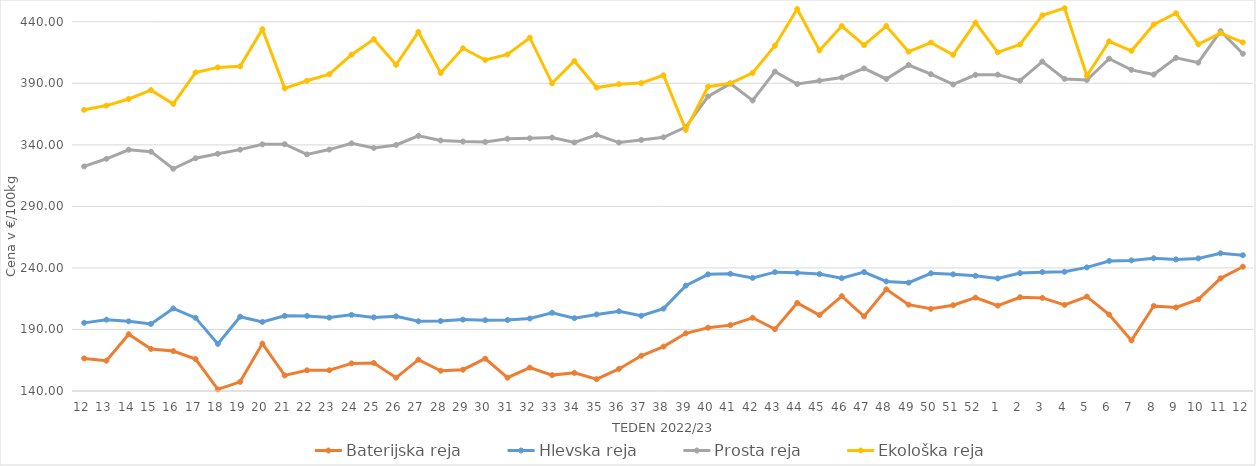
| Category | Baterijska reja | Hlevska reja | Prosta reja | Ekološka reja |
|---|---|---|---|---|
| 12.0 | 166.49 | 195.36 | 322.46 | 368.45 |
| 13.0 | 164.66 | 197.95 | 328.67 | 371.9 |
| 14.0 | 186.11 | 196.59 | 336.02 | 377.24 |
| 15.0 | 174.18 | 194.49 | 334.46 | 384.48 |
| 16.0 | 172.42 | 207.1 | 320.58 | 373.28 |
| 17.0 | 165.96 | 199.41 | 329.11 | 398.79 |
| 18.0 | 141.36 | 178.29 | 332.71 | 402.93 |
| 19.0 | 147.43 | 200.37 | 336.11 | 403.79 |
| 20.0 | 178.51 | 196.16 | 340.4 | 433.97 |
| 21.0 | 152.67 | 201.05 | 340.55 | 385.86 |
| 22.0 | 156.8 | 200.98 | 332.23 | 392.07 |
| 23.0 | 156.84 | 199.63 | 336.16 | 397.41 |
| 24.0 | 162.44 | 201.86 | 341.24 | 413.28 |
| 25.0 | 162.78 | 199.81 | 337.48 | 425.86 |
| 26.0 | 150.82 | 200.65 | 339.9 | 405 |
| 27.0 | 165.45 | 196.64 | 347.3 | 431.72 |
| 28.0 | 156.46 | 196.88 | 343.56 | 398.45 |
| 29.0 | 157.31 | 198.03 | 342.71 | 418.45 |
| 30.0 | 166.29 | 197.55 | 342.35 | 408.97 |
| 31.0 | 150.81 | 197.66 | 344.97 | 413.45 |
| 32.0 | 158.99 | 198.9 | 345.35 | 427.07 |
| 33.0 | 152.91 | 203.57 | 345.9 | 390 |
| 34.0 | 154.73 | 199.17 | 341.92 | 408.1 |
| 35.0 | 149.6 | 202.21 | 348.2 | 386.55 |
| 36.0 | 157.93 | 204.81 | 341.85 | 389.31 |
| 37.0 | 168.61 | 201.11 | 343.97 | 390.17 |
| 38.0 | 176.07 | 206.91 | 346.16 | 396.55 |
| 39.0 | 186.86 | 225.6 | 354.41 | 352.24 |
| 40.0 | 191.45 | 234.79 | 379.35 | 387.24 |
| 41.0 | 193.52 | 235.24 | 389.75 | 390 |
| 42.0 | 199.51 | 231.92 | 376.02 | 398.45 |
| 43.0 | 190.28 | 236.56 | 399.51 | 420.52 |
| 44.0 | 211.53 | 236.04 | 389.44 | 450.35 |
| 45.0 | 201.69 | 235.01 | 392.15 | 416.72 |
| 46.0 | 217.08 | 231.68 | 394.71 | 436.55 |
| 47.0 | 200.62 | 236.65 | 402.12 | 421.03 |
| 48.0 | 222.61 | 229.05 | 393.56 | 436.55 |
| 49.0 | 210.16 | 228.03 | 404.87 | 415.69 |
| 50.0 | 206.76 | 235.63 | 397.4 | 423.1 |
| 51.0 | 209.69 | 234.79 | 389.05 | 413.1 |
| 52.0 | 215.87 | 233.58 | 396.87 | 439.31 |
| 1.0 | 209.37 | 231.41 | 397.04 | 415.17 |
| 2.0 | 216.15 | 235.78 | 392.13 | 421.55 |
| 3.0 | 215.63 | 236.58 | 407.61 | 445.17 |
| 4.0 | 210 | 236.85 | 393.58 | 451.04 |
| 5.0 | 216.7 | 240.42 | 392.67 | 396.03 |
| 6.0 | 202.1 | 245.67 | 409.97 | 424.14 |
| 7.0 | 181.11 | 246.12 | 400.94 | 416.38 |
| 8.0 | 209.08 | 247.88 | 397.11 | 437.76 |
| 9.0 | 207.87 | 246.89 | 410.64 | 446.9 |
| 10.0 | 214.42 | 247.73 | 406.8 | 421.72 |
| 11.0 | 231.56 | 251.88 | 432.34 | 430.69 |
| 12.0 | 240.97 | 250.3 | 414 | 423.28 |